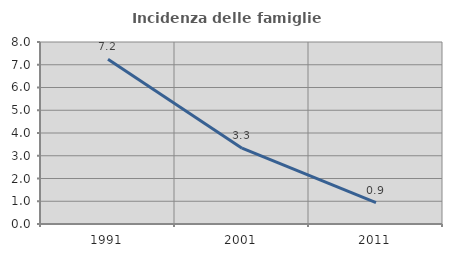
| Category | Incidenza delle famiglie numerose |
|---|---|
| 1991.0 | 7.24 |
| 2001.0 | 3.333 |
| 2011.0 | 0.943 |